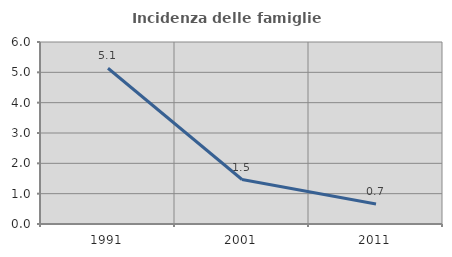
| Category | Incidenza delle famiglie numerose |
|---|---|
| 1991.0 | 5.135 |
| 2001.0 | 1.467 |
| 2011.0 | 0.657 |